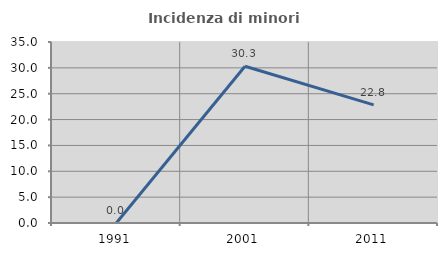
| Category | Incidenza di minori stranieri |
|---|---|
| 1991.0 | 0 |
| 2001.0 | 30.303 |
| 2011.0 | 22.849 |